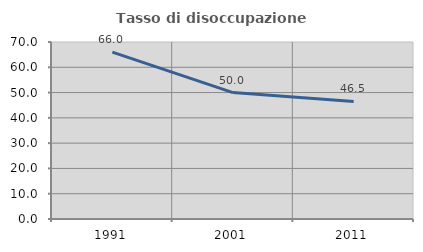
| Category | Tasso di disoccupazione giovanile  |
|---|---|
| 1991.0 | 66.01 |
| 2001.0 | 50 |
| 2011.0 | 46.491 |